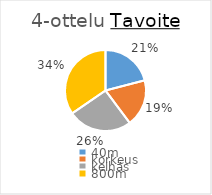
| Category | Series 0 |
|---|---|
| 40m | 157 |
| korkeus | 141 |
| keihäs | 192 |
| 800m | 259 |